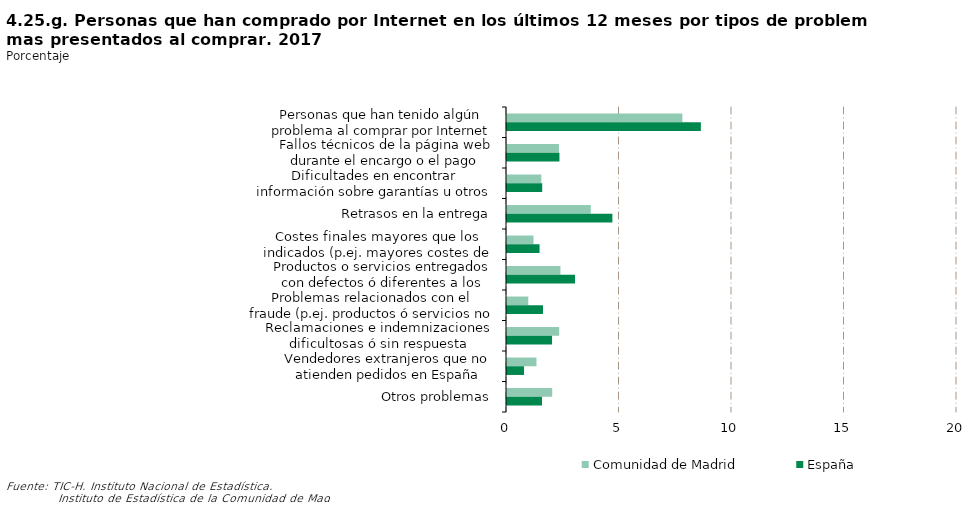
| Category | Comunidad de Madrid | España |
|---|---|---|
| Personas que han tenido algún problema al comprar por Internet en los últimos 12 meses | 7.793 | 8.617 |
| Fallos técnicos de la página web durante el encargo o el pago | 2.307 | 2.33 |
| Dificultades en encontrar información sobre garantías u otros derechos legales | 1.525 | 1.565 |
| Retrasos en la entrega | 3.723 | 4.684 |
| Costes finales mayores que los indicados (p.ej. mayores costes de entrega, gastos inesperados en la transacción, etc.) | 1.175 | 1.447 |
| Productos o servicios entregados con defectos ó diferentes a los encargados | 2.375 | 3.024 |
| Problemas relacionados con el fraude (p.ej. productos ó servicios no recibidos ó no recibidos en su totalidad, mal uso de los datos de la tarjeta de crédito, etc.) | 0.946 | 1.599 |
| Reclamaciones e indemnizaciones dificultosas ó sin respuesta satisfactoria tras la reclamación | 2.319 | 2.002 |
| Vendedores extranjeros que no atienden pedidos en España | 1.31 | 0.758 |
| Otros problemas | 2.009 | 1.556 |